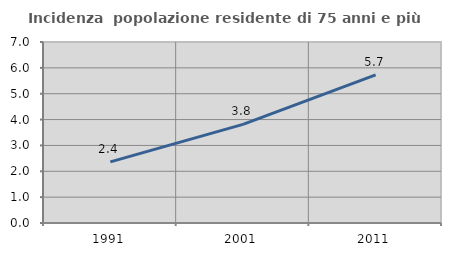
| Category | Incidenza  popolazione residente di 75 anni e più |
|---|---|
| 1991.0 | 2.363 |
| 2001.0 | 3.815 |
| 2011.0 | 5.73 |